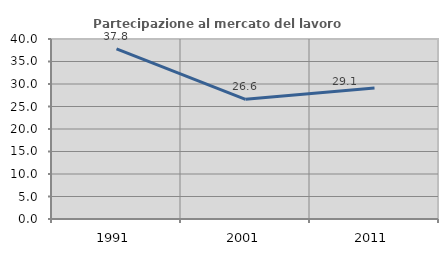
| Category | Partecipazione al mercato del lavoro  femminile |
|---|---|
| 1991.0 | 37.805 |
| 2001.0 | 26.588 |
| 2011.0 | 29.099 |